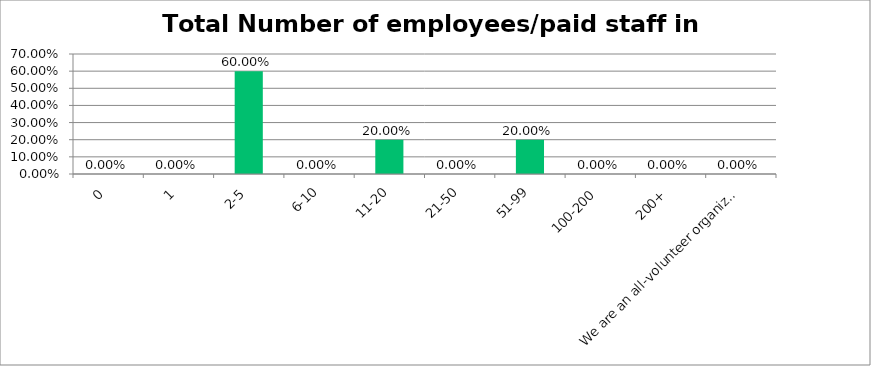
| Category | Responses |
|---|---|
| 0 | 0 |
| 1 | 0 |
| 2-5 | 0.6 |
| 6-10 | 0 |
| 11-20 | 0.2 |
| 21-50 | 0 |
| 51-99 | 0.2 |
| 100-200 | 0 |
| 200+ | 0 |
| We are an all-volunteer organization | 0 |